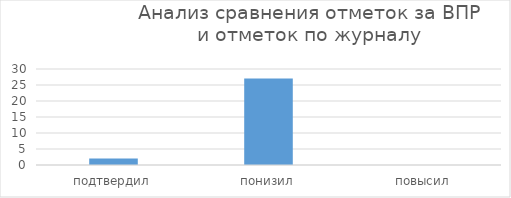
| Category | Series 0 |
|---|---|
| подтвердил | 2 |
| понизил | 27 |
| повысил | 0 |